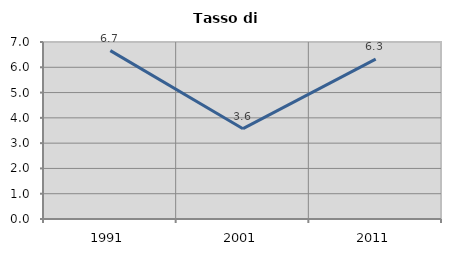
| Category | Tasso di disoccupazione   |
|---|---|
| 1991.0 | 6.658 |
| 2001.0 | 3.571 |
| 2011.0 | 6.324 |